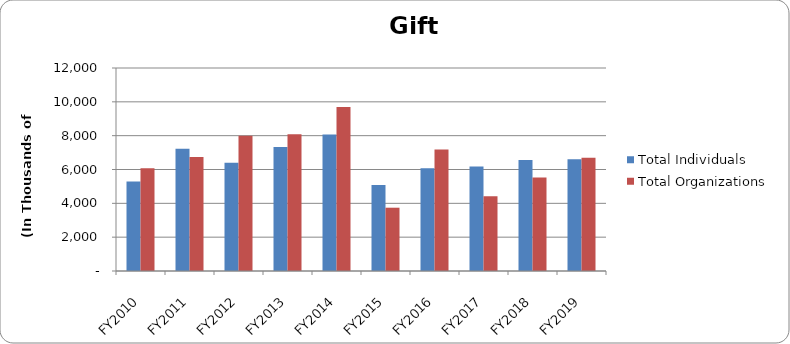
| Category | Total Individuals | Total Organizations |
|---|---|---|
| FY2010 | 5288.289 | 6067.634 |
| FY2011 | 7223.809 | 6736.248 |
| FY2012 | 6393.606 | 7994.661 |
| FY2013 | 7336.59 | 8084.945 |
| FY2014 | 8070.39 | 9700.804 |
| FY2015 | 5089.895 | 3741.563 |
| FY2016 | 6066.765 | 7189.106 |
| FY2017 | 6177.539 | 4425.963 |
| FY2018 | 6562.053 | 5526.489 |
| FY2019 | 6606.462 | 6694.322 |